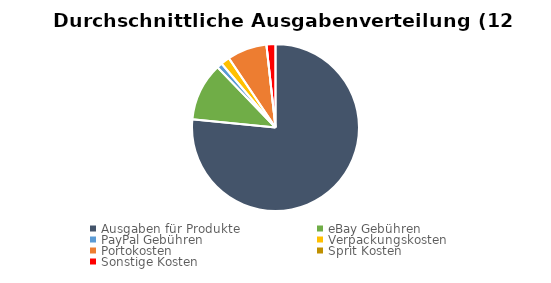
| Category | Series 0 |
|---|---|
| Ausgaben für Produkte | 220 |
| eBay Gebühren | 32.25 |
| PayPal Gebühren | 3 |
| Verpackungskosten | 5 |
| Portokosten | 22.083 |
| Sprit Kosten | 0 |
| Sonstige Kosten | 5 |